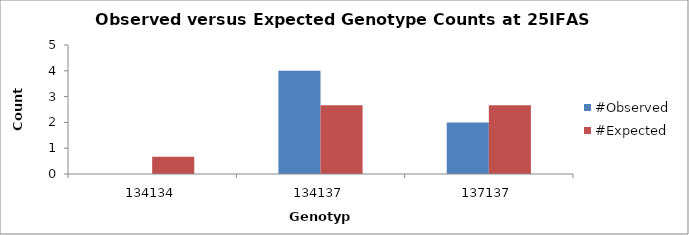
| Category | #Observed | #Expected |
|---|---|---|
| 134134.0 | 0 | 0.667 |
| 134137.0 | 4 | 2.667 |
| 137137.0 | 2 | 2.667 |